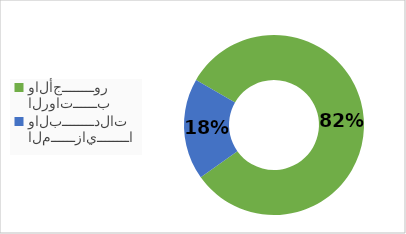
| Category | Series 0 |
|---|---|
| الرواتــــــب والأجــــــــور | 14304470 |
| المــــــزايــــــــا والبــــــــدلات | 3182158 |